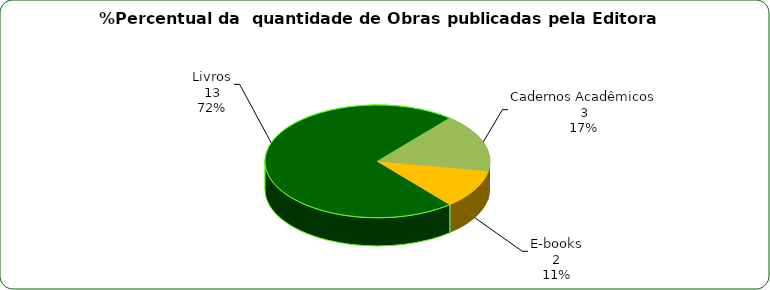
| Category | Series 0 |
|---|---|
| E-books | 2 |
| Livros | 13 |
| Cadernos Acadêmicos  | 3 |